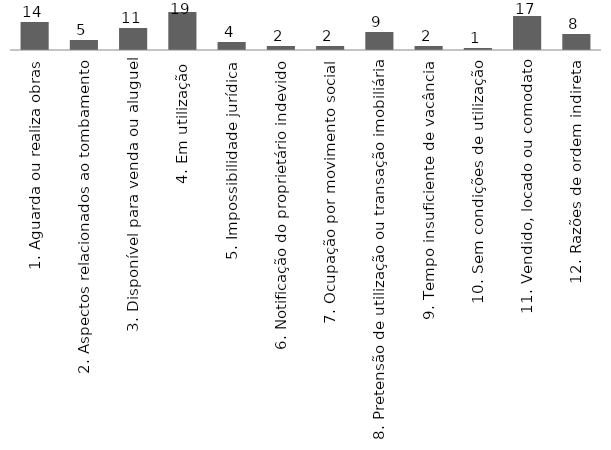
| Category | Series 0 |
|---|---|
| 1. Aguarda ou realiza obras | 14 |
| 2. Aspectos relacionados ao tombamento | 5 |
| 3. Disponível para venda ou aluguel | 11 |
| 4. Em utilização | 19 |
| 5. Impossibilidade jurídica | 4 |
| 6. Notificação do proprietário indevido | 2 |
| 7. Ocupação por movimento social | 2 |
| 8. Pretensão de utilização ou transação imobiliária | 9 |
| 9. Tempo insuficiente de vacância | 2 |
| 10. Sem condições de utilização | 1 |
| 11. Vendido, locado ou comodato | 17 |
| 12. Razões de ordem indireta | 8 |